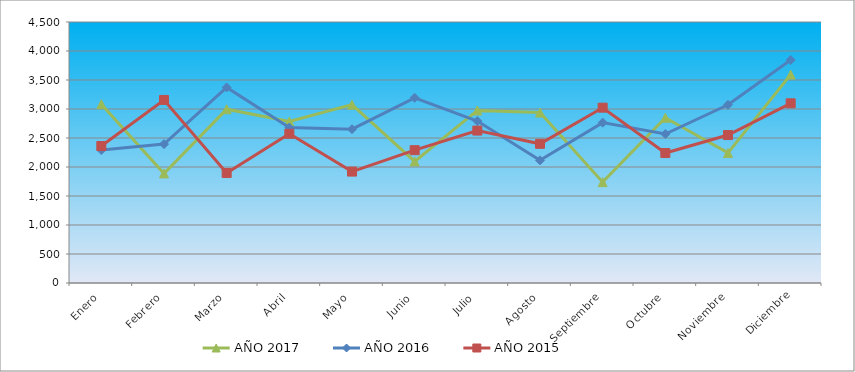
| Category | AÑO 2017 | AÑO 2016 | AÑO 2015 |
|---|---|---|---|
| Enero | 3082 | 2292 | 2362 |
| Febrero | 1889 | 2395 | 3156 |
| Marzo | 2996 | 3372 | 1897 |
| Abril | 2785 | 2679 | 2573 |
| Mayo | 3075 | 2652 | 1921 |
| Junio | 2096 | 3193 | 2290 |
| Julio | 2975 | 2792 | 2628 |
| Agosto | 2938 | 2115 | 2400 |
| Septiembre | 1739 | 2765 | 3023 |
| Octubre | 2848 | 2568 | 2241 |
| Noviembre | 2243 | 3073 | 2551 |
| Diciembre | 3593 | 3845 | 3098 |